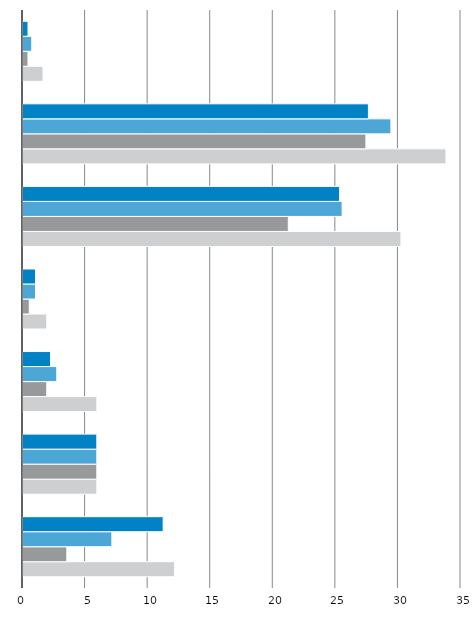
| Category | Summe von Maximum | Summe von Minimum | Summe von Deutschland | Summe von Anteil an den Beschäftigten insg. In % wB |
|---|---|---|---|---|
| 7 | 12.1 | 3.5 | 7.1 | 11.2 |
| 6 | 5.9 | 5.9 | 5.9 | 5.9 |
| 5 | 5.9 | 1.9 | 2.7 | 2.2 |
| 4 | 1.9 | 0.5 | 1 | 1 |
| 3 | 30.2 | 21.2 | 25.5 | 25.3 |
| 2 | 33.8 | 27.4 | 29.4 | 27.6 |
| 1 | 1.6 | 0.4 | 0.7 | 0.4 |